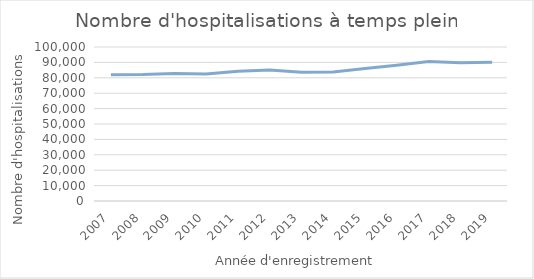
| Category | Nombre de séjours |
|---|---|
| 2007.0 | 82037 |
| 2008.0 | 82088 |
| 2009.0 | 82750 |
| 2010.0 | 82401 |
| 2011.0 | 84193 |
| 2012.0 | 85026 |
| 2013.0 | 83614 |
| 2014.0 | 83762 |
| 2015.0 | 86100 |
| 2016.0 | 88204 |
| 2017.0 | 90594 |
| 2018.0 | 89733 |
| 2019.0 | 90176 |